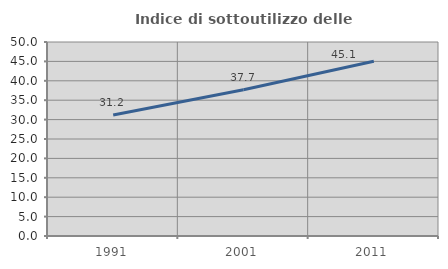
| Category | Indice di sottoutilizzo delle abitazioni  |
|---|---|
| 1991.0 | 31.189 |
| 2001.0 | 37.683 |
| 2011.0 | 45.052 |